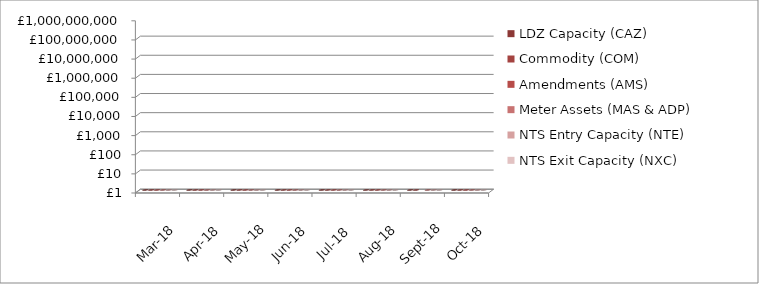
| Category | LDZ Capacity (CAZ) | Commodity (COM) | Amendments (AMS) | Meter Assets (MAS & ADP) | NTS Entry Capacity (NTE) | NTS Exit Capacity (NXC) |
|---|---|---|---|---|---|---|
| 2018-03-01 | 300714752.62 | 47885458.16 | 435828.94 | 193565.33 | 12522228.64 | 16944144.32 |
| 2018-04-01 | 302200317.27 | 29034584.31 | 1543453.44 | 194233.3 | 1577511.57 | 18111359.22 |
| 2018-05-01 | 312174512.16 | 19449237 | 2024085.07 | 200707.08 | 1599795.55 | 18702620.75 |
| 2018-06-01 | 302299412.99 | 14591606.04 | 2213969.29 | 194233.54 | 1621553.61 | 18117525.2 |
| 2018-07-01 | 312562745.62 | 14290600.7 | 1483244.96 | 200707.69 | 1735803.71 | 18720256.49 |
| 2018-08-01 | 312780813.69 | 15048321.28 | 830443.17 | 200263.88 | 1735803.71 | 18720256.49 |
| 2018-09-01 | 302866760.19 | 17528307.3 | -385853.99 | 189788.22 | 1760935.51 | 18113875.74 |
| 2018-10-01 | 313359948.83 | 29476349.27 | 58182.64 | 196114.17 | 8332609.71 | 13807265.85 |